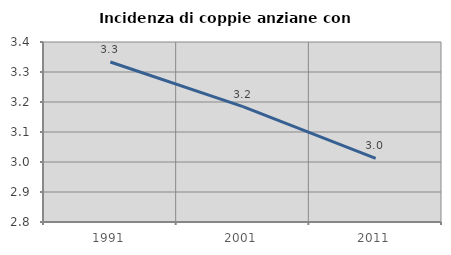
| Category | Incidenza di coppie anziane con figli |
|---|---|
| 1991.0 | 3.333 |
| 2001.0 | 3.185 |
| 2011.0 | 3.012 |